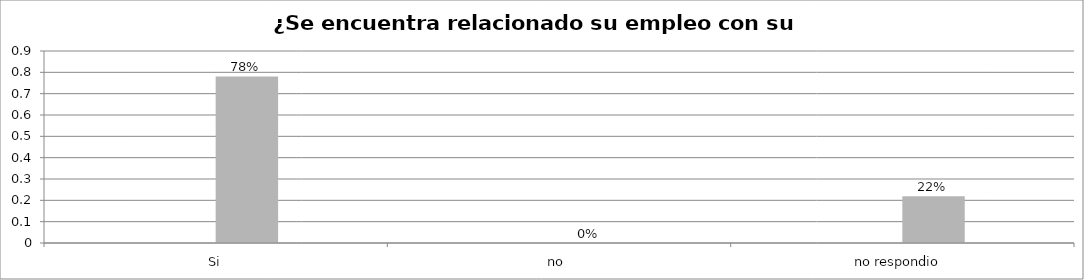
| Category | Series 0 | Series 1 | Series 2 | Series 3 |
|---|---|---|---|---|
| Si |  |  | 0.78 |  |
| no  |  |  | 0 |  |
| no respondio  |  |  | 0.22 |  |